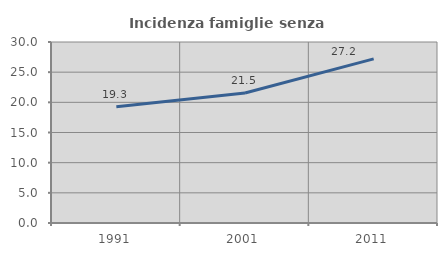
| Category | Incidenza famiglie senza nuclei |
|---|---|
| 1991.0 | 19.275 |
| 2001.0 | 21.537 |
| 2011.0 | 27.207 |